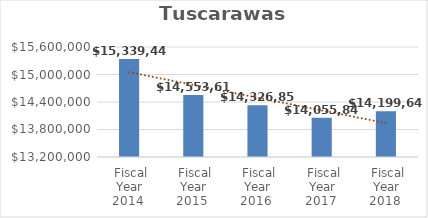
| Category | Tuscarawas Campus |
|---|---|
| Fiscal Year 2014 | 15339449 |
| Fiscal Year 2015 | 14553618 |
| Fiscal Year 2016 | 14326856 |
| Fiscal Year 2017 | 14055844 |
| Fiscal Year 2018 | 14199647 |